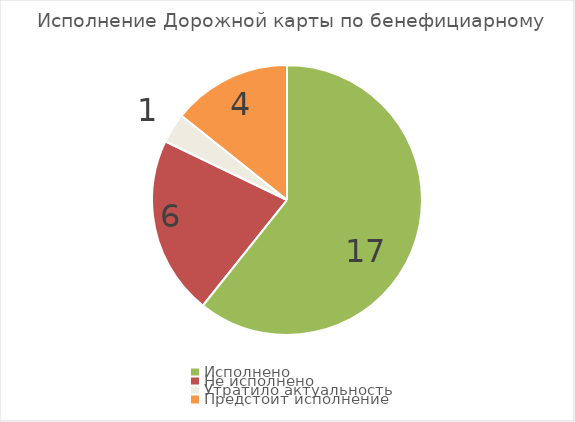
| Category | Series 0 |
|---|---|
| Исполнено | 17 |
| Не исполнено | 6 |
| Утратило актуальность | 1 |
| Предстоит исполнение | 4 |